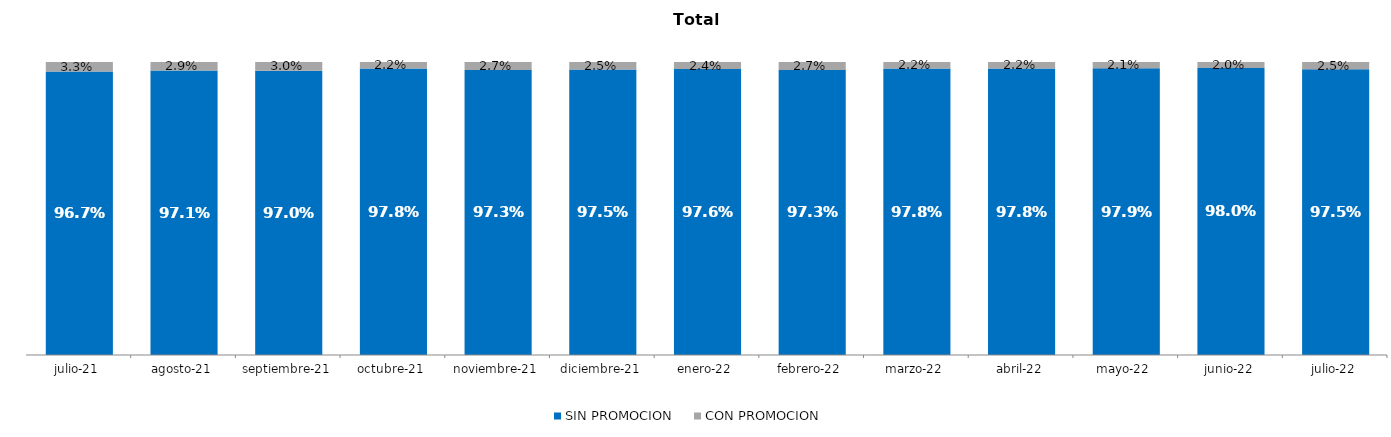
| Category | SIN PROMOCION   | CON PROMOCION   |
|---|---|---|
| 2021-07-01 | 0.967 | 0.033 |
| 2021-08-01 | 0.971 | 0.029 |
| 2021-09-01 | 0.97 | 0.03 |
| 2021-10-01 | 0.978 | 0.022 |
| 2021-11-01 | 0.973 | 0.027 |
| 2021-12-01 | 0.975 | 0.025 |
| 2022-01-01 | 0.976 | 0.024 |
| 2022-02-01 | 0.973 | 0.027 |
| 2022-03-01 | 0.978 | 0.022 |
| 2022-04-01 | 0.978 | 0.022 |
| 2022-05-01 | 0.979 | 0.021 |
| 2022-06-01 | 0.98 | 0.02 |
| 2022-07-01 | 0.975 | 0.025 |